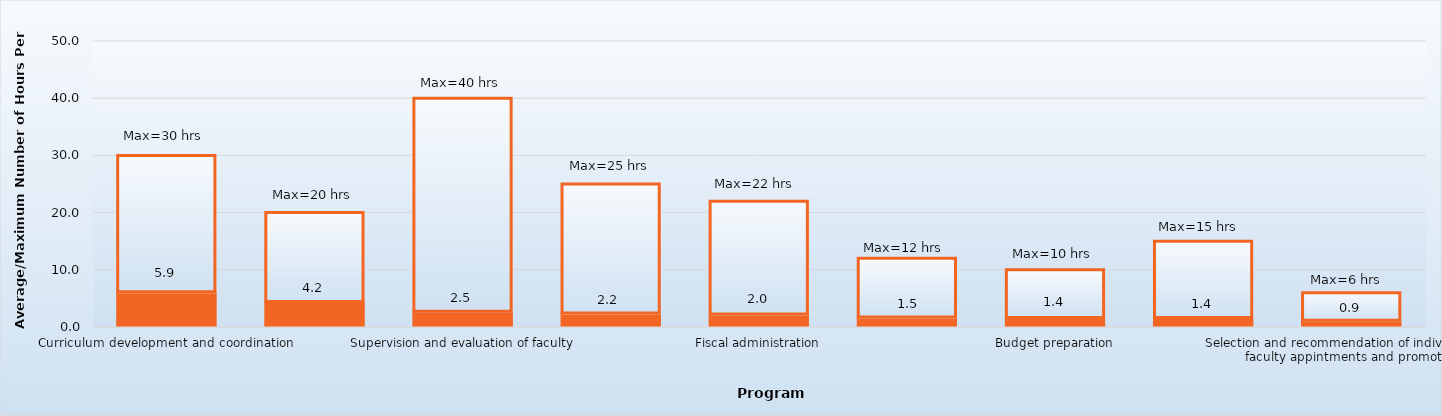
| Category | Average hours per week | Maximum |
|---|---|---|
| Curriculum development and coordination | 5.9 | 24.1 |
| Development and responsibilities to maintain CODA accreditation compliance and documentation | 4.2 | 15.8 |
| Supervision and evaluation of faculty | 2.5 | 37.5 |
| Determining faculty teaching assignments and schedules | 2.2 | 22.8 |
| Fiscal administration | 2 | 20 |
| Determining admissions criteria and procedures | 1.5 | 10.5 |
| Budget preparation | 1.4 | 8.6 |
| Scheduling use of program facilities | 1.4 | 13.6 |
| Selection and recommendation of individuals for faculty appintments and promotion | 0.9 | 5.1 |